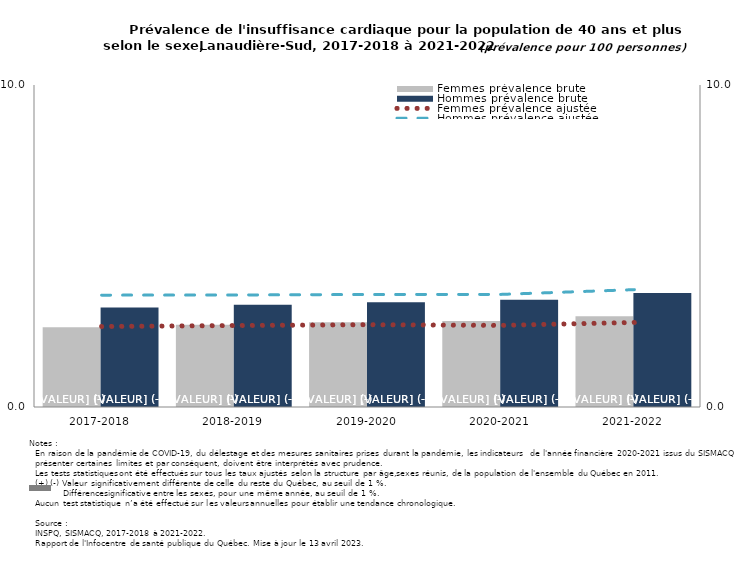
| Category | Femmes prévalence brute | Hommes prévalence brute |
|---|---|---|
| 2017-2018 | 2.478 | 3.092 |
| 2018-2019 | 2.556 | 3.174 |
| 2019-2020 | 2.634 | 3.251 |
| 2020-2021 | 2.671 | 3.329 |
| 2021-2022 | 2.815 | 3.537 |